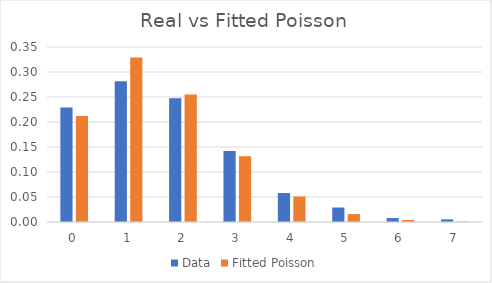
| Category | Data | Fitted Poisson |
|---|---|---|
| 0.0 | 0.229 | 0.212 |
| 1.0 | 0.282 | 0.329 |
| 2.0 | 0.247 | 0.255 |
| 3.0 | 0.142 | 0.132 |
| 4.0 | 0.058 | 0.051 |
| 5.0 | 0.029 | 0.016 |
| 6.0 | 0.008 | 0.004 |
| 7.0 | 0.005 | 0.001 |